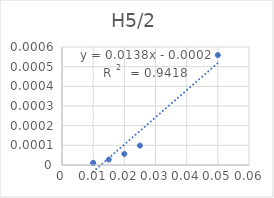
| Category | H5/2 |
|---|---|
| 0.02 | 0 |
| 0.01 | 0 |
| 0.015 | 0 |
| 0.05 | 0.001 |
| 0.025 | 0 |
| 0.01 | 0 |